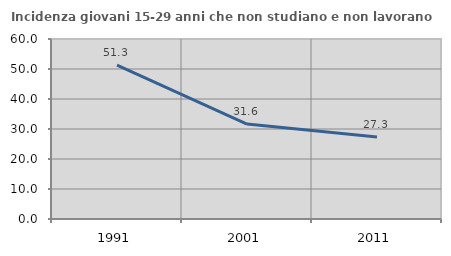
| Category | Incidenza giovani 15-29 anni che non studiano e non lavorano  |
|---|---|
| 1991.0 | 51.285 |
| 2001.0 | 31.638 |
| 2011.0 | 27.309 |